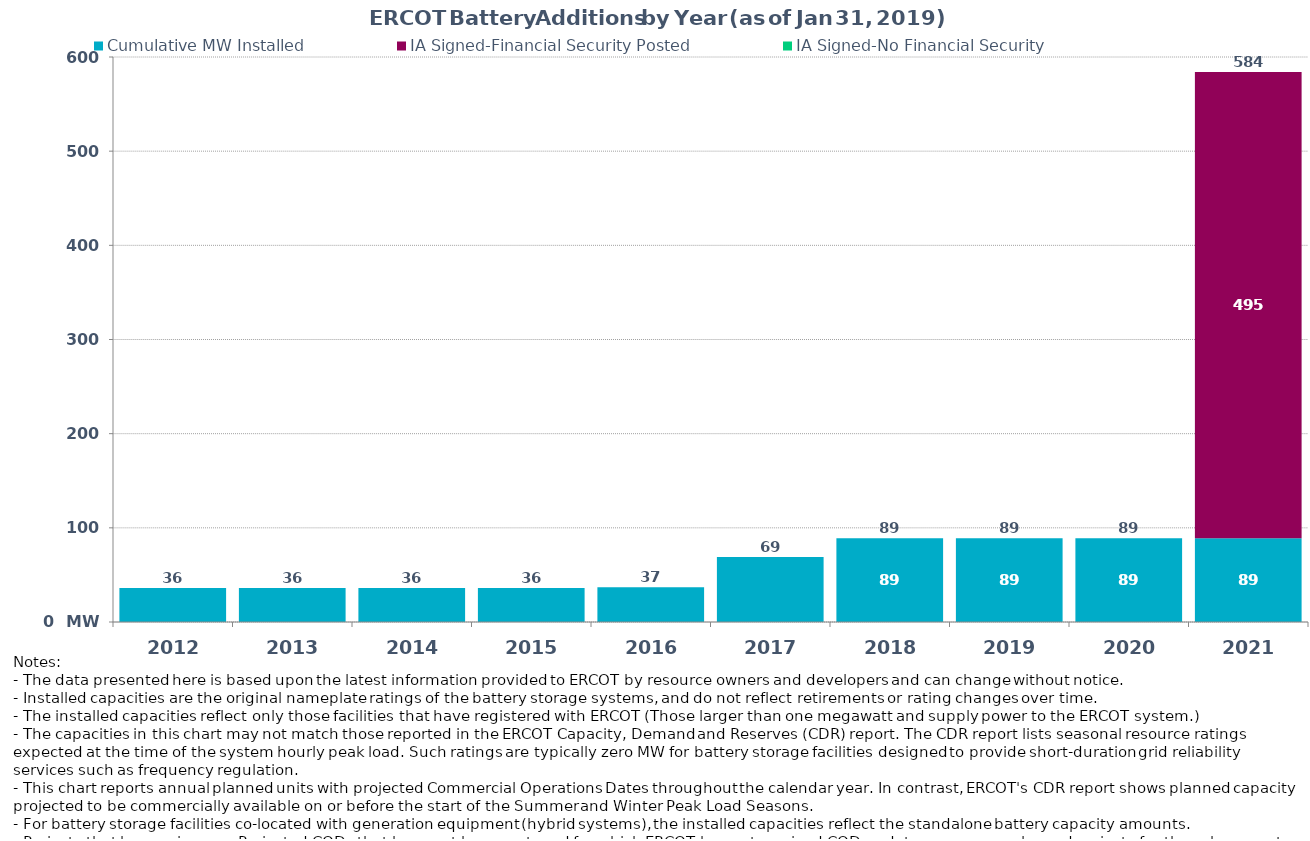
| Category | Cumulative MW Installed | IA Signed-Financial Security Posted  | IA Signed-No Financial Security  | Cumulative Installed and Planned |
|---|---|---|---|---|
| 2012.0 | 36 | 0 | 0 | 36 |
| 2013.0 | 36 | 0 | 0 | 36 |
| 2014.0 | 36 | 0 | 0 | 36 |
| 2015.0 | 36 | 0 | 0 | 36 |
| 2016.0 | 37 | 0 | 0 | 37 |
| 2017.0 | 69 | 0 | 0 | 69 |
| 2018.0 | 89 | 0 | 0 | 89 |
| 2019.0 | 89 | 0 | 0 | 89 |
| 2020.0 | 89 | 0 | 0 | 89 |
| 2021.0 | 89 | 495 | 0 | 584 |